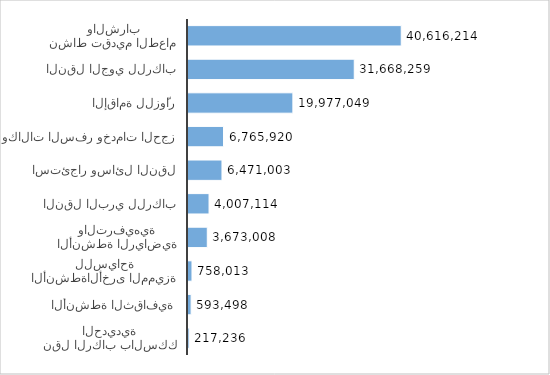
| Category | Series 0 |
|---|---|
| نشاط تقديم الطعام والشراب | 40616214 |
| النقل الجوي للركاب | 31668259 |
| الإقامة للزوّار | 19977049 |
| وكالات السفر وخدمات الحجز | 6765920 |
| استئجار وسائل النقل | 6471003 |
| النقل البري للركاب | 4007114 |
| الأنشطة الرياضية والترفيهية | 3673008 |
| الأنشطةالأخرى المميزة للسياحة | 758013 |
| الأنشطة الثقافية | 593498 |
| نقل الركاب بالسكك الحديدية | 217236 |